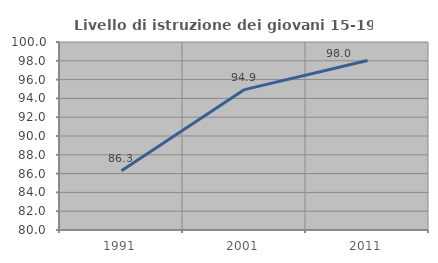
| Category | Livello di istruzione dei giovani 15-19 anni |
|---|---|
| 1991.0 | 86.303 |
| 2001.0 | 94.936 |
| 2011.0 | 98.037 |